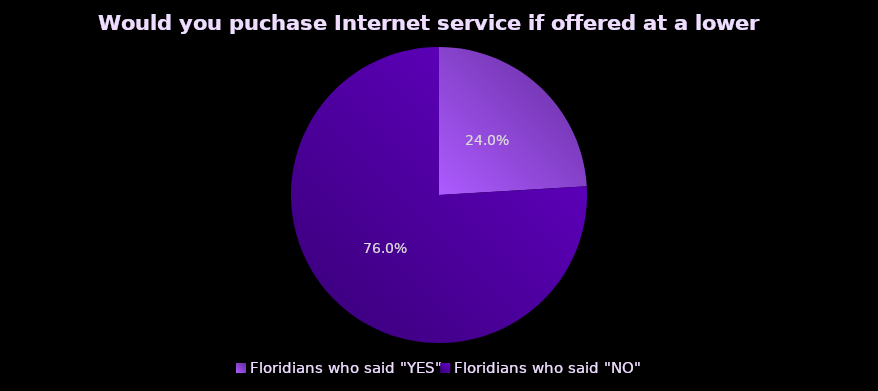
| Category | Series 0 |
|---|---|
| Floridians who said "YES" | 0.24 |
| Floridians who said "NO" | 0.76 |